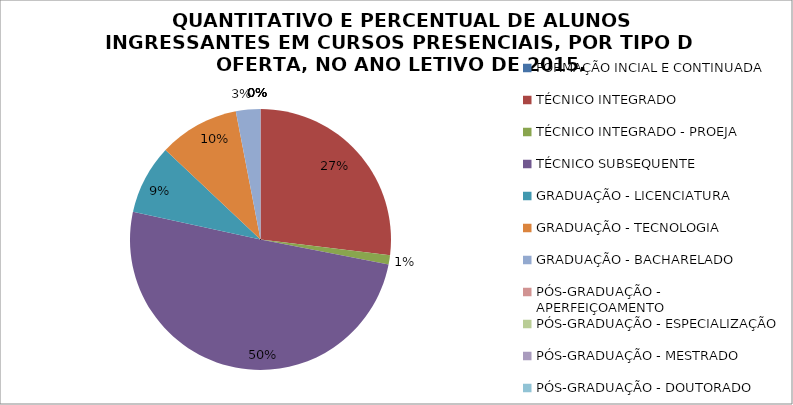
| Category | QUANTITATIVO E PERCENTUAL DE ALUNOS INGRESSANTES EM CURSOS PRESENCIAIS, POR TIPO DE OFERTA, NO ANO LETIVO DE 2015. |
|---|---|
| FORMAÇÃO INCIAL E CONTINUADA | 0 |
| TÉCNICO INTEGRADO | 26.917 |
| TÉCNICO INTEGRADO - PROEJA | 1.158 |
| TÉCNICO SUBSEQUENTE | 50.336 |
| GRADUAÇÃO - LICENCIATURA | 8.617 |
| GRADUAÇÃO - TECNOLOGIA | 9.937 |
| GRADUAÇÃO - BACHARELADO | 3.035 |
| PÓS-GRADUAÇÃO - APERFEIÇOAMENTO | 0 |
| PÓS-GRADUAÇÃO - ESPECIALIZAÇÃO | 0 |
| PÓS-GRADUAÇÃO - MESTRADO | 0 |
| PÓS-GRADUAÇÃO - DOUTORADO | 0 |